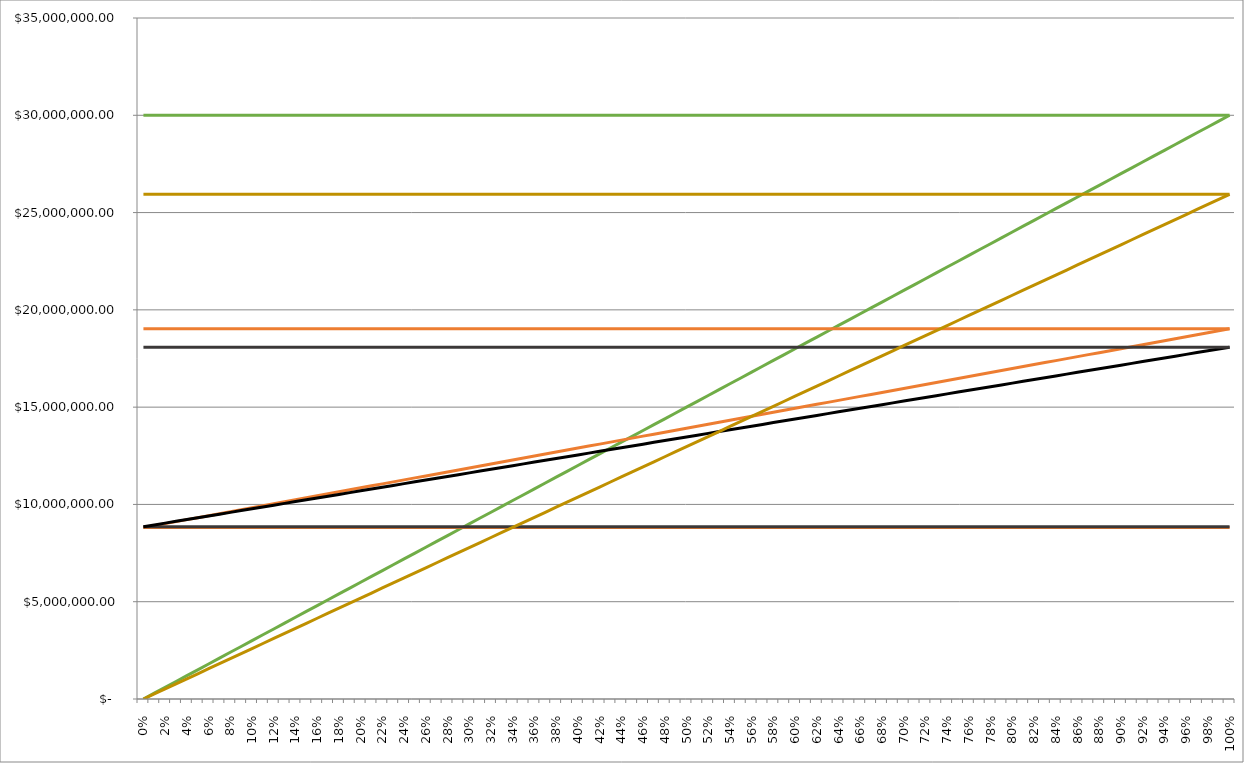
| Category | Ventas Año 2 y 5 | Ing | CFT Año 5 | CV Año 5 | CT Año 5 | CFT Año 1 | CV Año 1 | CT Año 1 | Ventas Año 1 | Ing Año 1 |
|---|---|---|---|---|---|---|---|---|---|---|
| 0.0 | 30000000 | 0 | 8809315.45 | 8809315.45 | 19026534.042 | 8853864.039 | 8853864.039 | 18080613.567 | 25937500 | 0 |
| 0.01 | 30000000 | 300000 | 8809315.45 | 8911487.636 | 19026534.042 | 8853864.039 | 8946131.535 | 18080613.567 | 25937500 | 259375 |
| 0.02 | 30000000 | 600000 | 8809315.45 | 9013659.822 | 19026534.042 | 8853864.039 | 9038399.03 | 18080613.567 | 25937500 | 518750 |
| 0.03 | 30000000 | 900000 | 8809315.45 | 9115832.007 | 19026534.042 | 8853864.039 | 9130666.525 | 18080613.567 | 25937500 | 778125 |
| 0.04 | 30000000 | 1200000 | 8809315.45 | 9218004.193 | 19026534.042 | 8853864.039 | 9222934.02 | 18080613.567 | 25937500 | 1037500 |
| 0.05 | 30000000 | 1500000 | 8809315.45 | 9320176.379 | 19026534.042 | 8853864.039 | 9315201.516 | 18080613.567 | 25937500 | 1296875 |
| 0.06 | 30000000 | 1800000 | 8809315.45 | 9422348.565 | 19026534.042 | 8853864.039 | 9407469.011 | 18080613.567 | 25937500 | 1556250 |
| 0.07 | 30000000 | 2100000 | 8809315.45 | 9524520.751 | 19026534.042 | 8853864.039 | 9499736.506 | 18080613.567 | 25937500 | 1815625 |
| 0.08 | 30000000 | 2400000 | 8809315.45 | 9626692.937 | 19026534.042 | 8853864.039 | 9592004.002 | 18080613.567 | 25937500 | 2075000 |
| 0.09 | 30000000 | 2700000 | 8809315.45 | 9728865.123 | 19026534.042 | 8853864.039 | 9684271.497 | 18080613.567 | 25937500 | 2334375 |
| 0.1 | 30000000 | 3000000 | 8809315.45 | 9831037.309 | 19026534.042 | 8853864.039 | 9776538.992 | 18080613.567 | 25937500 | 2593750 |
| 0.11 | 30000000 | 3300000 | 8809315.45 | 9933209.495 | 19026534.042 | 8853864.039 | 9868806.487 | 18080613.567 | 25937500 | 2853125 |
| 0.12 | 30000000 | 3600000 | 8809315.45 | 10035381.681 | 19026534.042 | 8853864.039 | 9961073.983 | 18080613.567 | 25937500 | 3112500 |
| 0.13 | 30000000 | 3900000 | 8809315.45 | 10137553.867 | 19026534.042 | 8853864.039 | 10053341.478 | 18080613.567 | 25937500 | 3371875 |
| 0.14 | 30000000 | 4200000 | 8809315.45 | 10239726.053 | 19026534.042 | 8853864.039 | 10145608.973 | 18080613.567 | 25937500 | 3631250 |
| 0.15 | 30000000 | 4500000 | 8809315.45 | 10341898.238 | 19026534.042 | 8853864.039 | 10237876.469 | 18080613.567 | 25937500 | 3890625 |
| 0.16 | 30000000 | 4800000 | 8809315.45 | 10444070.424 | 19026534.042 | 8853864.039 | 10330143.964 | 18080613.567 | 25937500 | 4150000 |
| 0.17 | 30000000 | 5100000 | 8809315.45 | 10546242.61 | 19026534.042 | 8853864.039 | 10422411.459 | 18080613.567 | 25937500 | 4409375 |
| 0.18 | 30000000 | 5400000 | 8809315.45 | 10648414.796 | 19026534.042 | 8853864.039 | 10514678.954 | 18080613.567 | 25937500 | 4668750 |
| 0.19 | 30000000 | 5700000 | 8809315.45 | 10750586.982 | 19026534.042 | 8853864.039 | 10606946.45 | 18080613.567 | 25937500 | 4928125 |
| 0.2 | 30000000 | 6000000 | 8809315.45 | 10852759.168 | 19026534.042 | 8853864.039 | 10699213.945 | 18080613.567 | 25937500 | 5187500 |
| 0.21 | 30000000 | 6300000 | 8809315.45 | 10954931.354 | 19026534.042 | 8853864.039 | 10791481.44 | 18080613.567 | 25937500 | 5446875 |
| 0.22 | 30000000 | 6600000 | 8809315.45 | 11057103.54 | 19026534.042 | 8853864.039 | 10883748.935 | 18080613.567 | 25937500 | 5706250 |
| 0.23 | 30000000 | 6900000 | 8809315.45 | 11159275.726 | 19026534.042 | 8853864.039 | 10976016.431 | 18080613.567 | 25937500 | 5965625 |
| 0.24 | 30000000 | 7200000 | 8809315.45 | 11261447.912 | 19026534.042 | 8853864.039 | 11068283.926 | 18080613.567 | 25937500 | 6225000 |
| 0.25 | 30000000 | 7500000 | 8809315.45 | 11363620.098 | 19026534.042 | 8853864.039 | 11160551.421 | 18080613.567 | 25937500 | 6484375 |
| 0.26 | 30000000 | 7800000 | 8809315.45 | 11465792.284 | 19026534.042 | 8853864.039 | 11252818.917 | 18080613.567 | 25937500 | 6743750 |
| 0.27 | 30000000 | 8100000 | 8809315.45 | 11567964.47 | 19026534.042 | 8853864.039 | 11345086.412 | 18080613.567 | 25937500 | 7003125 |
| 0.28 | 30000000 | 8400000 | 8809315.45 | 11670136.655 | 19026534.042 | 8853864.039 | 11437353.907 | 18080613.567 | 25937500 | 7262500 |
| 0.29 | 30000000 | 8700000 | 8809315.45 | 11772308.841 | 19026534.042 | 8853864.039 | 11529621.402 | 18080613.567 | 25937500 | 7521875 |
| 0.3 | 30000000 | 9000000 | 8809315.45 | 11874481.027 | 19026534.042 | 8853864.039 | 11621888.898 | 18080613.567 | 25937500 | 7781250 |
| 0.31 | 30000000 | 9300000 | 8809315.45 | 11976653.213 | 19026534.042 | 8853864.039 | 11714156.393 | 18080613.567 | 25937500 | 8040625 |
| 0.32 | 30000000 | 9600000 | 8809315.45 | 12078825.399 | 19026534.042 | 8853864.039 | 11806423.888 | 18080613.567 | 25937500 | 8300000 |
| 0.33 | 30000000 | 9900000 | 8809315.45 | 12180997.585 | 19026534.042 | 8853864.039 | 11898691.384 | 18080613.567 | 25937500 | 8559375 |
| 0.34 | 30000000 | 10200000 | 8809315.45 | 12283169.771 | 19026534.042 | 8853864.039 | 11990958.879 | 18080613.567 | 25937500 | 8818750 |
| 0.35 | 30000000 | 10500000 | 8809315.45 | 12385341.957 | 19026534.042 | 8853864.039 | 12083226.374 | 18080613.567 | 25937500 | 9078125 |
| 0.36 | 30000000 | 10800000 | 8809315.45 | 12487514.143 | 19026534.042 | 8853864.039 | 12175493.869 | 18080613.567 | 25937500 | 9337500 |
| 0.37 | 30000000 | 11100000 | 8809315.45 | 12589686.329 | 19026534.042 | 8853864.039 | 12267761.365 | 18080613.567 | 25937500 | 9596875 |
| 0.38 | 30000000 | 11400000 | 8809315.45 | 12691858.515 | 19026534.042 | 8853864.039 | 12360028.86 | 18080613.567 | 25937500 | 9856250 |
| 0.39 | 30000000 | 11700000 | 8809315.45 | 12794030.701 | 19026534.042 | 8853864.039 | 12452296.355 | 18080613.567 | 25937500 | 10115625 |
| 0.4 | 30000000 | 12000000 | 8809315.45 | 12896202.886 | 19026534.042 | 8853864.039 | 12544563.85 | 18080613.567 | 25937500 | 10375000 |
| 0.41 | 30000000 | 12300000 | 8809315.45 | 12998375.072 | 19026534.042 | 8853864.039 | 12636831.346 | 18080613.567 | 25937500 | 10634375 |
| 0.42 | 30000000 | 12600000 | 8809315.45 | 13100547.258 | 19026534.042 | 8853864.039 | 12729098.841 | 18080613.567 | 25937500 | 10893750 |
| 0.43 | 30000000 | 12900000 | 8809315.45 | 13202719.444 | 19026534.042 | 8853864.039 | 12821366.336 | 18080613.567 | 25937500 | 11153125 |
| 0.44 | 30000000 | 13200000 | 8809315.45 | 13304891.63 | 19026534.042 | 8853864.039 | 12913633.832 | 18080613.567 | 25937500 | 11412500 |
| 0.45 | 30000000 | 13500000 | 8809315.45 | 13407063.816 | 19026534.042 | 8853864.039 | 13005901.327 | 18080613.567 | 25937500 | 11671875 |
| 0.46 | 30000000 | 13800000 | 8809315.45 | 13509236.002 | 19026534.042 | 8853864.039 | 13098168.822 | 18080613.567 | 25937500 | 11931250 |
| 0.47 | 30000000 | 14100000 | 8809315.45 | 13611408.188 | 19026534.042 | 8853864.039 | 13190436.317 | 18080613.567 | 25937500 | 12190625 |
| 0.48 | 30000000 | 14400000 | 8809315.45 | 13713580.374 | 19026534.042 | 8853864.039 | 13282703.813 | 18080613.567 | 25937500 | 12450000 |
| 0.49 | 30000000 | 14700000 | 8809315.45 | 13815752.56 | 19026534.042 | 8853864.039 | 13374971.308 | 18080613.567 | 25937500 | 12709375 |
| 0.5 | 30000000 | 15000000 | 8809315.45 | 13917924.746 | 19026534.042 | 8853864.039 | 13467238.803 | 18080613.567 | 25937500 | 12968750 |
| 0.51 | 30000000 | 15300000 | 8809315.45 | 14020096.932 | 19026534.042 | 8853864.039 | 13559506.299 | 18080613.567 | 25937500 | 13228125 |
| 0.52 | 30000000 | 15600000 | 8809315.45 | 14122269.118 | 19026534.042 | 8853864.039 | 13651773.794 | 18080613.567 | 25937500 | 13487500 |
| 0.53 | 30000000 | 15900000 | 8809315.45 | 14224441.303 | 19026534.042 | 8853864.039 | 13744041.289 | 18080613.567 | 25937500 | 13746875 |
| 0.54 | 30000000 | 16200000 | 8809315.45 | 14326613.489 | 19026534.042 | 8853864.039 | 13836308.784 | 18080613.567 | 25937500 | 14006250 |
| 0.55 | 30000000 | 16500000 | 8809315.45 | 14428785.675 | 19026534.042 | 8853864.039 | 13928576.28 | 18080613.567 | 25937500 | 14265625 |
| 0.56 | 30000000 | 16800000 | 8809315.45 | 14530957.861 | 19026534.042 | 8853864.039 | 14020843.775 | 18080613.567 | 25937500 | 14525000 |
| 0.57 | 30000000 | 17100000 | 8809315.45 | 14633130.047 | 19026534.042 | 8853864.039 | 14113111.27 | 18080613.567 | 25937500 | 14784375 |
| 0.58 | 30000000 | 17400000 | 8809315.45 | 14735302.233 | 19026534.042 | 8853864.039 | 14205378.765 | 18080613.567 | 25937500 | 15043750 |
| 0.59 | 30000000 | 17700000 | 8809315.45 | 14837474.419 | 19026534.042 | 8853864.039 | 14297646.261 | 18080613.567 | 25937500 | 15303125 |
| 0.6 | 30000000 | 18000000 | 8809315.45 | 14939646.605 | 19026534.042 | 8853864.039 | 14389913.756 | 18080613.567 | 25937500 | 15562500 |
| 0.61 | 30000000 | 18300000 | 8809315.45 | 15041818.791 | 19026534.042 | 8853864.039 | 14482181.251 | 18080613.567 | 25937500 | 15821875 |
| 0.62 | 30000000 | 18600000 | 8809315.45 | 15143990.977 | 19026534.042 | 8853864.039 | 14574448.747 | 18080613.567 | 25937500 | 16081250 |
| 0.63 | 30000000 | 18900000 | 8809315.45 | 15246163.163 | 19026534.042 | 8853864.039 | 14666716.242 | 18080613.567 | 25937500 | 16340625 |
| 0.64 | 30000000 | 19200000 | 8809315.45 | 15348335.349 | 19026534.042 | 8853864.039 | 14758983.737 | 18080613.567 | 25937500 | 16600000 |
| 0.65 | 30000000 | 19500000 | 8809315.45 | 15450507.534 | 19026534.042 | 8853864.039 | 14851251.232 | 18080613.567 | 25937500 | 16859375 |
| 0.66 | 30000000 | 19800000 | 8809315.45 | 15552679.72 | 19026534.042 | 8853864.039 | 14943518.728 | 18080613.567 | 25937500 | 17118750 |
| 0.67 | 30000000 | 20100000 | 8809315.45 | 15654851.906 | 19026534.042 | 8853864.039 | 15035786.223 | 18080613.567 | 25937500 | 17378125 |
| 0.68 | 30000000 | 20400000 | 8809315.45 | 15757024.092 | 19026534.042 | 8853864.039 | 15128053.718 | 18080613.567 | 25937500 | 17637500 |
| 0.69 | 30000000 | 20700000 | 8809315.45 | 15859196.278 | 19026534.042 | 8853864.039 | 15220321.214 | 18080613.567 | 25937500 | 17896875 |
| 0.7 | 30000000 | 21000000 | 8809315.45 | 15961368.464 | 19026534.042 | 8853864.039 | 15312588.709 | 18080613.567 | 25937500 | 18156250 |
| 0.71 | 30000000 | 21300000 | 8809315.45 | 16063540.65 | 19026534.042 | 8853864.039 | 15404856.204 | 18080613.567 | 25937500 | 18415625 |
| 0.72 | 30000000 | 21600000 | 8809315.45 | 16165712.836 | 19026534.042 | 8853864.039 | 15497123.699 | 18080613.567 | 25937500 | 18675000 |
| 0.73 | 30000000 | 21900000 | 8809315.45 | 16267885.022 | 19026534.042 | 8853864.039 | 15589391.195 | 18080613.567 | 25937500 | 18934375 |
| 0.74 | 30000000 | 22200000 | 8809315.45 | 16370057.208 | 19026534.042 | 8853864.039 | 15681658.69 | 18080613.567 | 25937500 | 19193750 |
| 0.75 | 30000000 | 22500000 | 8809315.45 | 16472229.394 | 19026534.042 | 8853864.039 | 15773926.185 | 18080613.567 | 25937500 | 19453125 |
| 0.76 | 30000000 | 22800000 | 8809315.45 | 16574401.58 | 19026534.042 | 8853864.039 | 15866193.68 | 18080613.567 | 25937500 | 19712500 |
| 0.77 | 30000000 | 23100000 | 8809315.45 | 16676573.766 | 19026534.042 | 8853864.039 | 15958461.176 | 18080613.567 | 25937500 | 19971875 |
| 0.78 | 30000000 | 23400000 | 8809315.45 | 16778745.951 | 19026534.042 | 8853864.039 | 16050728.671 | 18080613.567 | 25937500 | 20231250 |
| 0.79 | 30000000 | 23700000 | 8809315.45 | 16880918.137 | 19026534.042 | 8853864.039 | 16142996.166 | 18080613.567 | 25937500 | 20490625 |
| 0.8 | 30000000 | 24000000 | 8809315.45 | 16983090.323 | 19026534.042 | 8853864.039 | 16235263.662 | 18080613.567 | 25937500 | 20750000 |
| 0.81 | 30000000 | 24300000 | 8809315.45 | 17085262.509 | 19026534.042 | 8853864.039 | 16327531.157 | 18080613.567 | 25937500 | 21009375 |
| 0.82 | 30000000 | 24600000 | 8809315.45 | 17187434.695 | 19026534.042 | 8853864.039 | 16419798.652 | 18080613.567 | 25937500 | 21268750 |
| 0.83 | 30000000 | 24900000 | 8809315.45 | 17289606.881 | 19026534.042 | 8853864.039 | 16512066.147 | 18080613.567 | 25937500 | 21528125 |
| 0.84 | 30000000 | 25200000 | 8809315.45 | 17391779.067 | 19026534.042 | 8853864.039 | 16604333.643 | 18080613.567 | 25937500 | 21787500 |
| 0.85 | 30000000 | 25500000 | 8809315.45 | 17493951.253 | 19026534.042 | 8853864.039 | 16696601.138 | 18080613.567 | 25937500 | 22046875 |
| 0.86 | 30000000 | 25800000 | 8809315.45 | 17596123.439 | 19026534.042 | 8853864.039 | 16788868.633 | 18080613.567 | 25937500 | 22306250 |
| 0.87 | 30000000 | 26100000 | 8809315.45 | 17698295.625 | 19026534.042 | 8853864.039 | 16881136.129 | 18080613.567 | 25937500 | 22565625 |
| 0.88 | 30000000 | 26400000 | 8809315.45 | 17800467.811 | 19026534.042 | 8853864.039 | 16973403.624 | 18080613.567 | 25937500 | 22825000 |
| 0.89 | 30000000 | 26700000 | 8809315.45 | 17902639.997 | 19026534.042 | 8853864.039 | 17065671.119 | 18080613.567 | 25937500 | 23084375 |
| 0.9 | 30000000 | 27000000 | 8809315.45 | 18004812.182 | 19026534.042 | 8853864.039 | 17157938.614 | 18080613.567 | 25937500 | 23343750 |
| 0.91 | 30000000 | 27300000 | 8809315.45 | 18106984.368 | 19026534.042 | 8853864.039 | 17250206.11 | 18080613.567 | 25937500 | 23603125 |
| 0.92 | 30000000 | 27600000 | 8809315.45 | 18209156.554 | 19026534.042 | 8853864.039 | 17342473.605 | 18080613.567 | 25937500 | 23862500 |
| 0.93 | 30000000 | 27900000 | 8809315.45 | 18311328.74 | 19026534.042 | 8853864.039 | 17434741.1 | 18080613.567 | 25937500 | 24121875 |
| 0.94 | 30000000 | 28200000 | 8809315.45 | 18413500.926 | 19026534.042 | 8853864.039 | 17527008.595 | 18080613.567 | 25937500 | 24381250 |
| 0.95 | 30000000 | 28500000 | 8809315.45 | 18515673.112 | 19026534.042 | 8853864.039 | 17619276.091 | 18080613.567 | 25937500 | 24640625 |
| 0.96 | 30000000 | 28800000 | 8809315.45 | 18617845.298 | 19026534.042 | 8853864.039 | 17711543.586 | 18080613.567 | 25937500 | 24900000 |
| 0.97 | 30000000 | 29100000 | 8809315.45 | 18720017.484 | 19026534.042 | 8853864.039 | 17803811.081 | 18080613.567 | 25937500 | 25159375 |
| 0.98 | 30000000 | 29400000 | 8809315.45 | 18822189.67 | 19026534.042 | 8853864.039 | 17896078.577 | 18080613.567 | 25937500 | 25418750 |
| 0.99 | 30000000 | 29700000 | 8809315.45 | 18924361.856 | 19026534.042 | 8853864.039 | 17988346.072 | 18080613.567 | 25937500 | 25678125 |
| 1.0 | 30000000 | 30000000 | 8809315.45 | 19026534.042 | 19026534.042 | 8853864.039 | 18080613.567 | 18080613.567 | 25937500 | 25937500 |